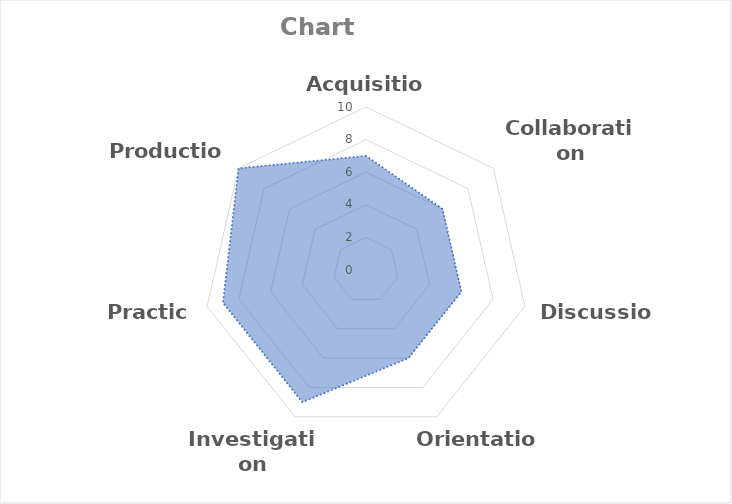
| Category | Series 0 | Acquisition |
|---|---|---|
| Acquisition | 7 | 0 |
| Collaboration | 6 | 0 |
| Discussion | 6 | 0 |
| Orientation | 6 | 0 |
| Investigation | 9 | 0 |
| Practice | 9 | 0 |
| Production | 10 | 0 |